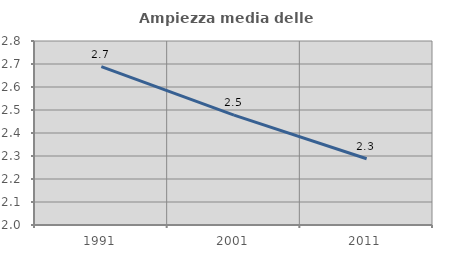
| Category | Ampiezza media delle famiglie |
|---|---|
| 1991.0 | 2.688 |
| 2001.0 | 2.477 |
| 2011.0 | 2.288 |